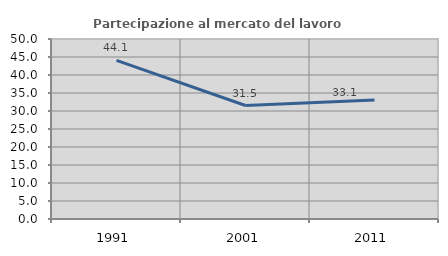
| Category | Partecipazione al mercato del lavoro  femminile |
|---|---|
| 1991.0 | 44.076 |
| 2001.0 | 31.524 |
| 2011.0 | 33.057 |